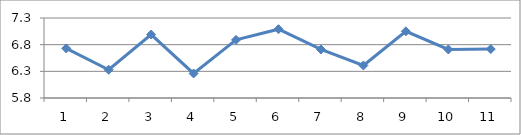
| Category | Series 0 |
|---|---|
| 0 | 6.73 |
| 1 | 6.33 |
| 2 | 6.99 |
| 3 | 6.26 |
| 4 | 6.89 |
| 5 | 7.09 |
| 6 | 6.71 |
| 7 | 6.41 |
| 8 | 7.05 |
| 9 | 6.71 |
| 10 | 6.717 |